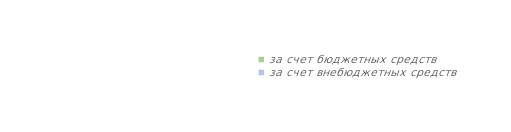
| Category | Series 0 |
|---|---|
| за счет бюджетных средств | 0 |
| за счет внебюджетных средств | 0 |